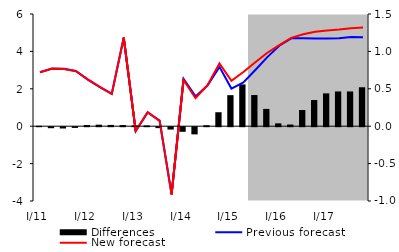
| Category | Differences |
|---|---|
| I/11 | 0.005 |
| II | -0.013 |
| III | -0.017 |
| IV | -0.009 |
| I/12 | 0.016 |
| II | 0.02 |
| III | 0.017 |
| IV | 0.015 |
| I/13 | 0.011 |
| II | 0.011 |
| III | -0.012 |
| IV | -0.031 |
| I/14 | -0.061 |
| II | -0.096 |
| III | 0.013 |
| IV | 0.187 |
| I/15 | 0.415 |
| II | 0.559 |
| III | 0.417 |
| IV | 0.231 |
| I/16 | 0.038 |
| II | 0.023 |
| III | 0.217 |
| IV | 0.35 |
| I/17 | 0.439 |
| II | 0.465 |
| III | 0.465 |
| IV | 0.521 |